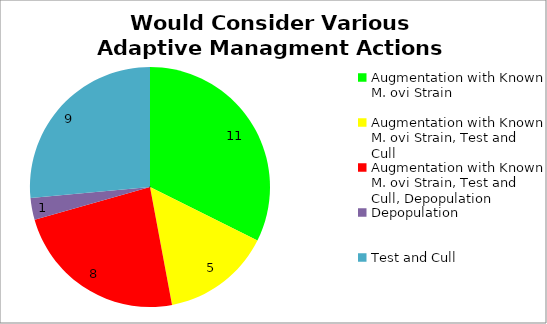
| Category | Series 0 |
|---|---|
| Augmentation with Known M. ovi Strain | 11 |
| Augmentation with Known M. ovi Strain, Test and Cull | 5 |
| Augmentation with Known M. ovi Strain, Test and Cull, Depopulation | 8 |
| Depopulation | 1 |
| Test and Cull | 9 |